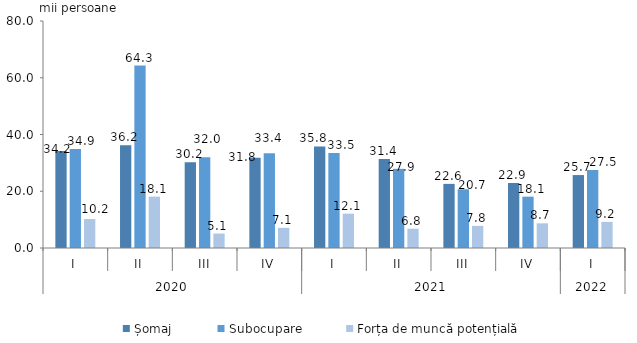
| Category | Șomaj | Subocupare | Forța de muncă potențială |
|---|---|---|---|
| 0 | 34.2 | 34.9 | 10.2 |
| 1 | 36.2 | 64.3 | 18.1 |
| 2 | 30.2 | 32 | 5.1 |
| 3 | 31.8 | 33.4 | 7.1 |
| 4 | 35.8 | 33.5 | 12.1 |
| 5 | 31.4 | 27.9 | 6.8 |
| 6 | 22.6 | 20.7 | 7.8 |
| 7 | 22.9 | 18.1 | 8.7 |
| 8 | 25.7 | 27.5 | 9.2 |